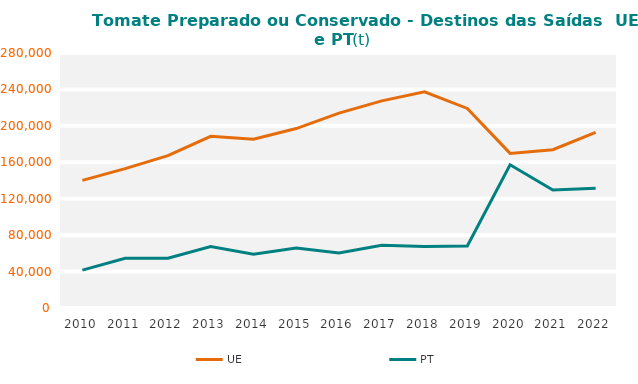
| Category | UE | PT |
|---|---|---|
| 2010.0 | 140180.763 | 41543.045 |
| 2011.0 | 153092.74 | 54555.179 |
| 2012.0 | 167334.366 | 54574.261 |
| 2013.0 | 188512.438 | 67423.067 |
| 2014.0 | 185213.363 | 58930.708 |
| 2015.0 | 197036.08 | 65903.13 |
| 2016.0 | 213988.535 | 60316.142 |
| 2017.0 | 227461.983 | 68805.509 |
| 2018.0 | 237433.567 | 67621.111 |
| 2019.0 | 219144.395 | 68188.875 |
| 2020.0 | 169777.887 | 157303.77 |
| 2021.0 | 173782.163 | 129630.468 |
| 2022.0 | 192935.515 | 131360.686 |